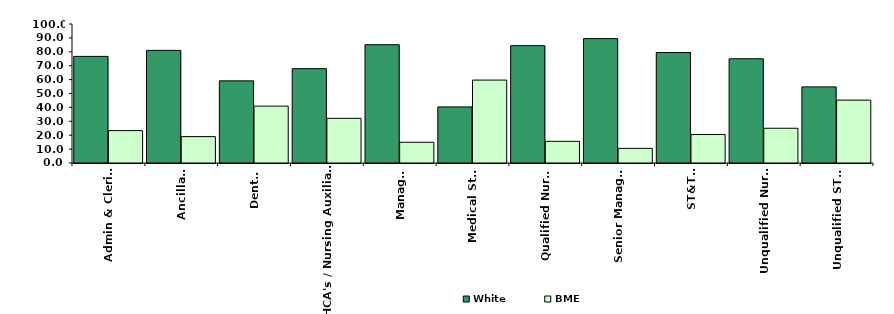
| Category | White | BME |
|---|---|---|
| Admin & Clerical | 76.703 | 23.297 |
| Ancillary | 81.022 | 18.978 |
| Dental | 59.091 | 40.909 |
| HCA's / Nursing Auxiliaries | 67.872 | 32.128 |
| Manager | 85.075 | 14.925 |
| Medical Staff | 40.351 | 59.649 |
| Qualified Nurses | 84.402 | 15.598 |
| Senior Managers | 89.474 | 10.526 |
| ST&T's | 79.481 | 20.519 |
| Unqualified Nurses | 75 | 25 |
| Unqualified ST&T's | 54.762 | 45.238 |